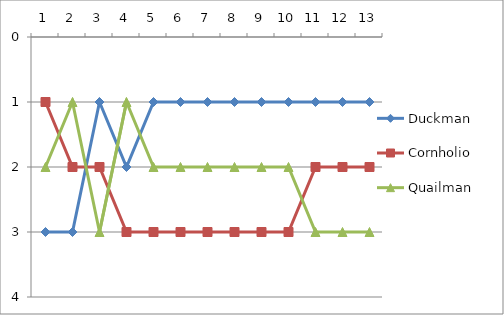
| Category | Duckman | Cornholio | Quailman |
|---|---|---|---|
| 0 | 3 | 1 | 2 |
| 1 | 3 | 2 | 1 |
| 2 | 1 | 2 | 3 |
| 3 | 2 | 3 | 1 |
| 4 | 1 | 3 | 2 |
| 5 | 1 | 3 | 2 |
| 6 | 1 | 3 | 2 |
| 7 | 1 | 3 | 2 |
| 8 | 1 | 3 | 2 |
| 9 | 1 | 3 | 2 |
| 10 | 1 | 2 | 3 |
| 11 | 1 | 2 | 3 |
| 12 | 1 | 2 | 3 |